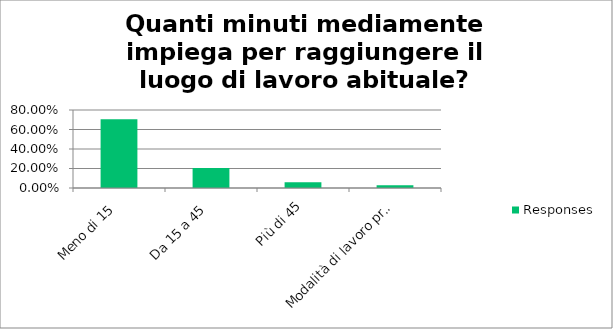
| Category | Responses |
|---|---|
| Meno di 15 | 0.706 |
| Da 15 a 45 | 0.206 |
| Più di 45 | 0.059 |
| Modalità di lavoro prevalentemente a distanza | 0.029 |